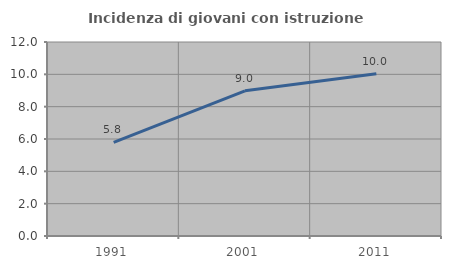
| Category | Incidenza di giovani con istruzione universitaria |
|---|---|
| 1991.0 | 5.797 |
| 2001.0 | 8.98 |
| 2011.0 | 10.042 |